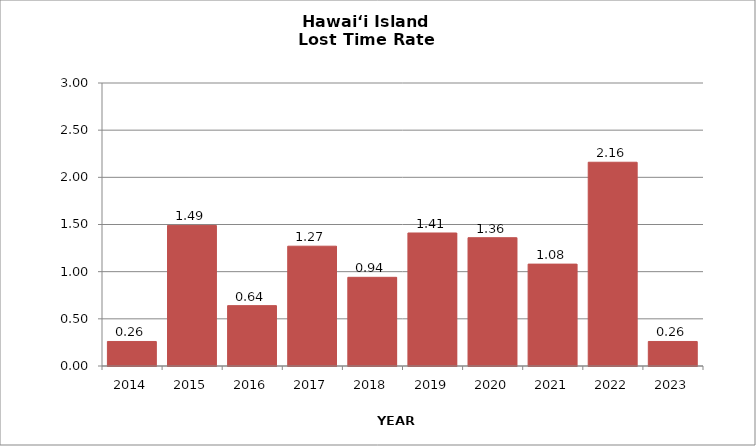
| Category | Hawai‘i Island |
|---|---|
| 2014.0 | 0.26 |
| 2015.0 | 1.49 |
| 2016.0 | 0.64 |
| 2017.0 | 1.27 |
| 2018.0 | 0.94 |
| 2019.0 | 1.41 |
| 2020.0 | 1.36 |
| 2021.0 | 1.08 |
| 2022.0 | 2.16 |
| 2023.0 | 0.26 |